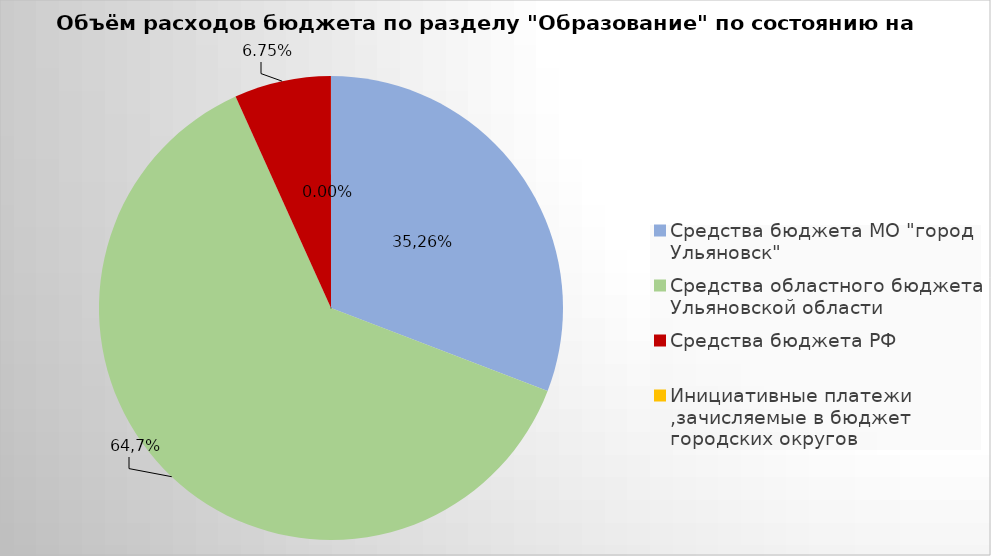
| Category | Series 0 |
|---|---|
| Средства бюджета МО "город Ульяновск" | 1837439.26 |
| Средства областного бюджета Ульяновской области | 3720634.3 |
| Средства бюджета РФ | 401928.3 |
| Инициативные платежи ,зачисляемые в бюджет городских округов | 200 |